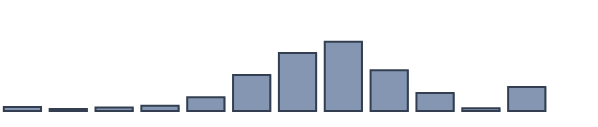
| Category | Series 0 |
|---|---|
| 0 | 1.478 |
| 1 | 0.696 |
| 2 | 1.304 |
| 3 | 1.913 |
| 4 | 4.957 |
| 5 | 13 |
| 6 | 20.913 |
| 7 | 24.957 |
| 8 | 14.696 |
| 9 | 6.522 |
| 10 | 0.957 |
| 11 | 8.609 |
| 12 | 0 |